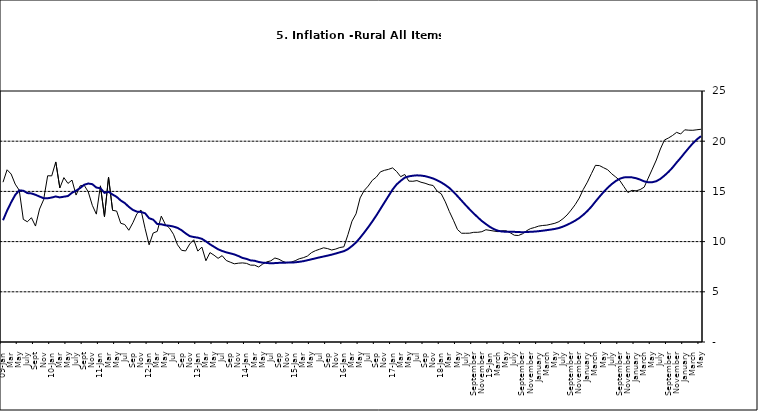
| Category | Series 0 | Series 1 |
|---|---|---|
| 09-Jan | 15.918 | 12.128 |
| Feb | 17.154 | 13.086 |
| Mar | 16.729 | 13.912 |
| Apr | 15.727 | 14.644 |
| May | 15.113 | 15.104 |
| June | 12.213 | 15.067 |
| July | 11.974 | 14.832 |
| Aug | 12.38 | 14.796 |
| Sept | 11.548 | 14.661 |
| Oct | 13.242 | 14.488 |
| Nov | 14.164 | 14.321 |
|  | 16.557 | 14.316 |
| 10-Jan | 16.548 | 14.39 |
| Feb | 17.934 | 14.494 |
| Mar | 15.346 | 14.401 |
| Apr | 16.373 | 14.473 |
| May | 15.794 | 14.54 |
| June | 16.126 | 14.862 |
| July | 14.634 | 15.072 |
| Aug | 15.556 | 15.33 |
| Sept | 15.616 | 15.658 |
| Oct | 14.955 | 15.786 |
| Nov | 13.616 | 15.719 |
| Dec | 12.735 | 15.385 |
| 11-Jan | 15.553 | 15.311 |
| Feb | 12.482 | 14.856 |
| Mar | 16.422 | 14.956 |
| Apr | 13.117 | 14.687 |
| May | 13.041 | 14.457 |
| Jun | 11.83 | 14.095 |
| Jul | 11.699 | 13.84 |
| Aug | 11.13 | 13.464 |
| Sep | 11.878 | 13.156 |
| Oct | 12.778 | 12.985 |
| Nov | 13.147 | 12.95 |
| Dec | 11.326 | 12.824 |
| 12-Jan | 9.678 | 12.33 |
| Feb | 10.856 | 12.188 |
| Mar | 11.014 | 11.76 |
| Apr | 12.536 | 11.724 |
| May | 11.712 | 11.621 |
| Jun | 11.36 | 11.582 |
| Jul | 10.733 | 11.499 |
| Aug | 9.683 | 11.368 |
| Sep | 9.132 | 11.131 |
| Oct | 9.071 | 10.82 |
| Nov | 9.758 | 10.548 |
| Dec | 10.183 | 10.455 |
| 13-Jan | 9.052 | 10.394 |
| Feb | 9.457 | 10.276 |
| Mar | 8.091 | 10.025 |
| Apr | 8.907 | 9.732 |
| May | 8.647 | 9.483 |
| Jun | 8.333 | 9.236 |
| Jul | 8.6 | 9.063 |
| Aug | 8.12 | 8.933 |
| Sep | 7.95 | 8.832 |
| Oct | 7.791 | 8.722 |
| Nov | 7.849 | 8.565 |
| Dec | 7.879 | 8.378 |
| 14-Jan | 7.832 | 8.277 |
| Feb | 7.657 | 8.13 |
| Mar | 7.65 | 8.092 |
| Apr | 7.473 | 7.973 |
| May | 7.761 | 7.901 |
| Jun | 7.98 | 7.874 |
| Jul | 8.086 | 7.834 |
| Aug | 8.368 | 7.858 |
| Sep | 8.244 | 7.883 |
| Oct | 8.019 | 7.903 |
| Nov | 7.898 | 7.906 |
| Dec | 7.955 | 7.913 |
| 15-Jan | 8.094 | 7.935 |
| Feb | 8.291 | 7.988 |
| Mar | 8.396 | 8.05 |
| Apr | 8.556 | 8.14 |
| May | 8.896 | 8.236 |
| Jun | 9.098 | 8.331 |
| Jul | 9.238 | 8.429 |
| Aug | 9.382 | 8.516 |
| Sep | 9.3 | 8.606 |
| Oct | 9.162 | 8.7 |
| Nov | 9.261 | 8.813 |
| Dec | 9.41 | 8.933 |
| 16-Jan | 9.48 | 9.047 |
| Feb | 10.692 | 9.249 |
| Mar | 12.038 | 9.559 |
| Apr | 12.767 | 9.917 |
| May | 14.349 | 10.384 |
| Jun | 15.088 | 10.897 |
| Jul | 15.533 | 11.433 |
| Aug | 16.103 | 12.002 |
| Sep | 16.428 | 12.601 |
| Oct | 16.947 | 13.25 |
| Nov | 17.099 | 13.898 |
| Dec | 17.195 | 14.54 |
| 17-Jan | 17.341 | 15.183 |
| Feb | 16.982 | 15.696 |
| Mar | 16.466 | 16.054 |
| Apr | 16.687 | 16.369 |
| May | 16.023 | 16.497 |
| Jun | 16.007 | 16.563 |
| Jul | 16.078 | 16.6 |
| Aug | 15.914 | 16.577 |
| Sep | 15.812 | 16.52 |
| Oct | 15.666 | 16.411 |
| Nov | 15.587 | 16.285 |
| Dec | 15.018 | 16.104 |
| 18-Jan | 14.756 | 15.892 |
| Feb | 13.957 | 15.638 |
| Mar | 12.987 | 15.339 |
| Apr | 12.126 | 14.95 |
| May | 11.199 | 14.53 |
| June | 10.832 | 14.083 |
| July | 10.831 | 13.636 |
| August | 10.838 | 13.209 |
| September | 10.924 | 12.804 |
| October | 10.927 | 12.418 |
| November | 10.986 | 12.049 |
| December | 11.183 | 11.746 |
| 19-Jan | 11.115 | 11.462 |
| February | 11.048 | 11.234 |
| March | 10.99 | 11.078 |
| April | 11.08 | 10.997 |
| May | 11.075 | 10.988 |
| June | 10.874 | 10.99 |
| July | 10.636 | 10.972 |
| August | 10.609 | 10.951 |
| September | 10.771 | 10.937 |
| October | 11.074 | 10.95 |
| November | 11.296 | 10.977 |
| December | 11.406 | 10.998 |
| January | 11.543 | 11.037 |
| February | 11.606 | 11.086 |
| March | 11.639 | 11.141 |
| April | 11.728 | 11.197 |
| May | 11.826 | 11.261 |
| June | 11.988 | 11.355 |
| July | 12.28 | 11.493 |
| August | 12.651 | 11.664 |
| September | 13.14 | 11.864 |
| October | 13.68 | 12.086 |
| November | 14.335 | 12.346 |
| December | 15.2 | 12.67 |
| January | 15.918 | 13.043 |
| February | 16.766 | 13.482 |
| March | 17.596 | 13.985 |
| April | 17.566 | 14.475 |
| May | 17.358 | 14.935 |
| June | 17.159 | 15.362 |
| July | 16.753 | 15.726 |
| August | 16.433 | 16.03 |
| September | 16.081 | 16.26 |
| October | 15.48 | 16.393 |
| November | 14.89 | 16.419 |
| December | 15.106 | 16.397 |
| January | 15.055 | 16.313 |
| February | 15.179 | 16.176 |
| March | 15.421 | 15.999 |
| April | 16.321 | 15.908 |
| May | 17.215 | 15.915 |
| June | 18.128 | 16.017 |
| July | 19.224 | 16.246 |
| August | 20.118 | 16.575 |
| September | 20.322 | 16.944 |
| October | 20.572 | 17.376 |
| November | 20.882 | 17.876 |
| December | 20.718 | 18.342 |
| January | 21.134 | 18.844 |
| February | 21.096 | 19.329 |
| March | 21.088 | 19.79 |
| April | 21.138 | 20.18 |
| May | 21.19 | 20.501 |